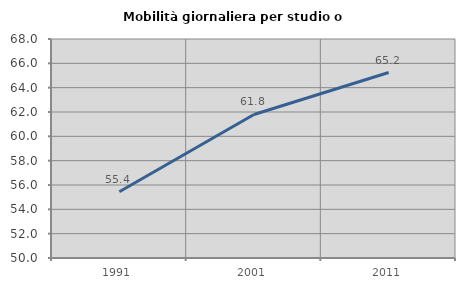
| Category | Mobilità giornaliera per studio o lavoro |
|---|---|
| 1991.0 | 55.45 |
| 2001.0 | 61.797 |
| 2011.0 | 65.242 |